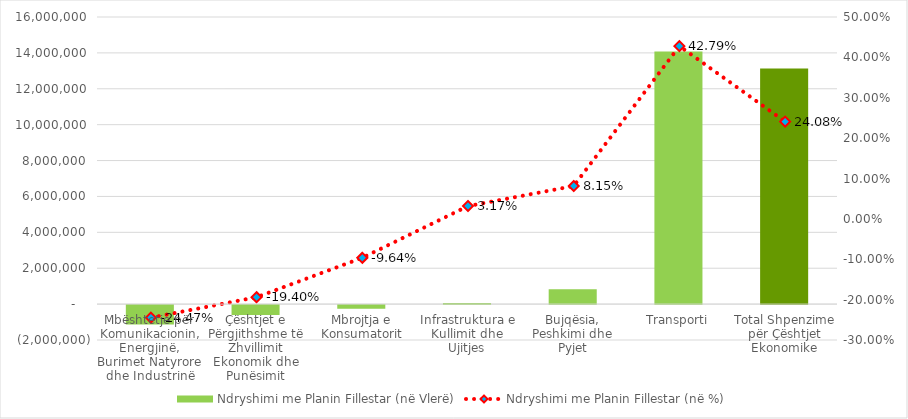
| Category | Ndryshimi me Planin Fillestar (në Vlerë) |
|---|---|
| Mbështetje për Komunikacionin, Energjinë, Burimet Natyrore dhe Industrinë | -1086270 |
| Çështjet e Përgjithshme të Zhvillimit Ekonomik dhe Punësimit | -549410 |
| Mbrojtja e Konsumatorit | -208000 |
| Infrastruktura e Kullimit dhe Ujitjes | 65600 |
| Bujqësia, Peshkimi dhe Pyjet | 823910 |
| Transporti | 14078700 |
| Total Shpenzime për Çështjet Ekonomike | 13124530 |